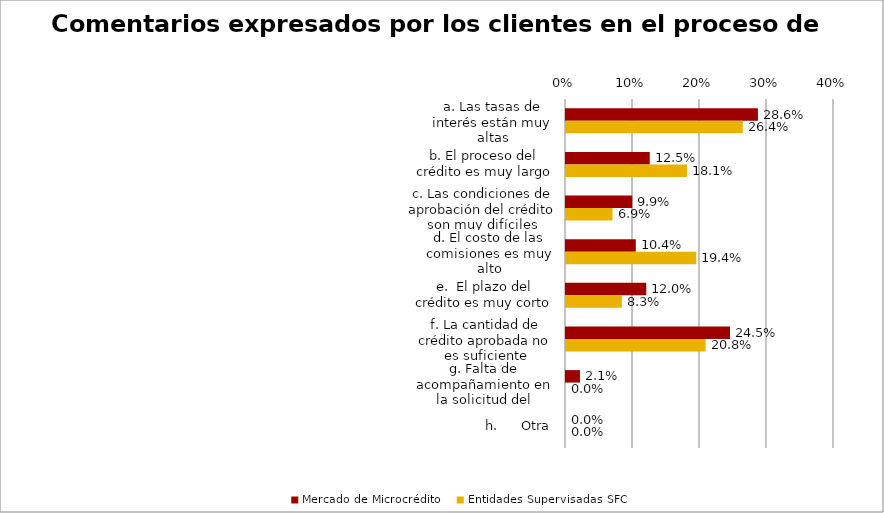
| Category | Mercado de Microcrédito | Entidades Supervisadas SFC |
|---|---|---|
| a. Las tasas de interés están muy altas | 0.286 | 0.264 |
| b. El proceso del crédito es muy largo | 0.125 | 0.181 |
| c. Las condiciones de aprobación del crédito son muy difíciles | 0.099 | 0.069 |
| d. El costo de las comisiones es muy alto | 0.104 | 0.194 |
| e.  El plazo del crédito es muy corto | 0.12 | 0.083 |
| f. La cantidad de crédito aprobada no es suficiente | 0.245 | 0.208 |
| g. Falta de acompañamiento en la solicitud del crédito | 0.021 | 0 |
| h.      Otra | 0 | 0 |